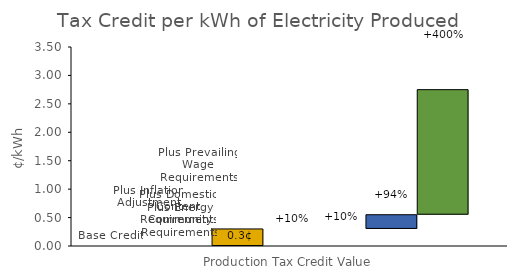
| Category | Space 1 | Space 2 | Base Credit | Plus Energy Community Requirements | Plus Domestic Content Requirements | Plus Inflation Adjustment | Plus Prevailing Wage Requirements |
|---|---|---|---|---|---|---|---|
| 0 | 0 | 0 | 0.3 | 0 | 0 | 0.25 | 2.2 |